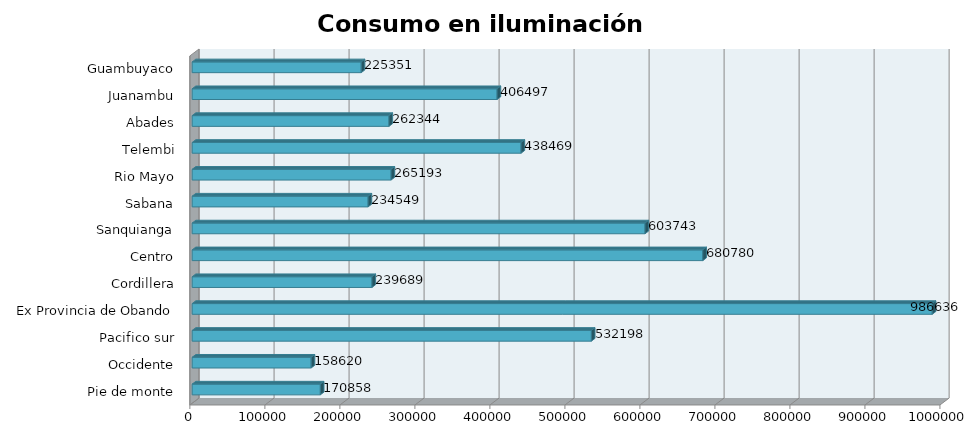
| Category | Series 0 |
|---|---|
| Pie de monte | 170858.096 |
| Occidente | 158620.15 |
| Pacifico sur | 532198.166 |
| Ex Provincia de Obando | 986636.084 |
| Cordillera | 239688.714 |
| Centro | 680780.3 |
| Sanquianga | 603742.954 |
| Sabana | 234549.389 |
| Rio Mayo | 265193.012 |
| Telembi | 438469.257 |
| Abades | 262343.806 |
| Juanambu | 406497.288 |
| Guambuyaco | 225351.071 |